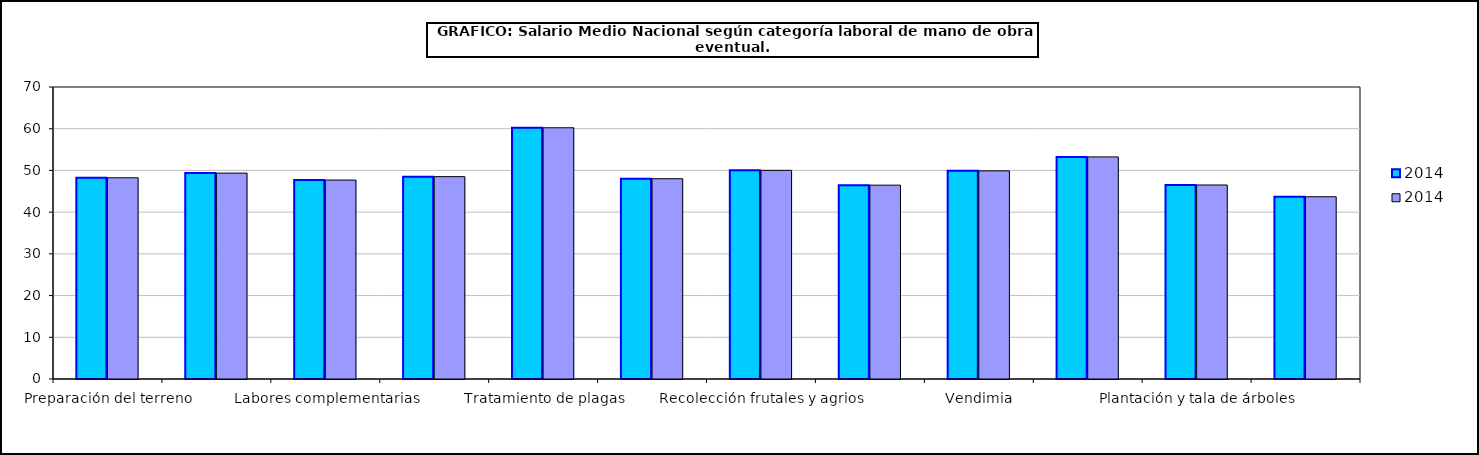
| Category | 2014 |
|---|---|
|  Preparación del terreno | 48.24 |
|  Siembra y abonado | 49.36 |
|  Labores complementarias | 47.69 |
|  Riegos | 48.51 |
|  Tratamiento de plagas | 60.23 |
|  Recolección productos herbáceos | 48.01 |
|  Recolección frutales y agrios | 50.02 |
|  Recolección de aceituna | 46.47 |
|  Vendimia | 49.9 |
|  Poda | 53.24 |
|  Plantación y tala de árboles | 46.51 |
|  Manejo de ganado | 43.69 |